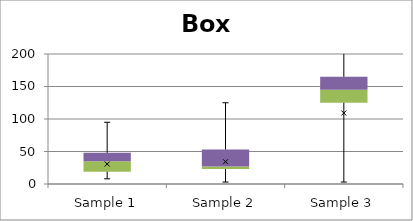
| Category | Min | Q1-Min | Med-Q1 | Q3-Med |
|---|---|---|---|---|
| Sample 1 | 8 | 11 | 16 | 13 |
| Sample 2 | 3 | 20 | 4 | 26 |
| Sample 3 | 3 | 122 | 20 | 20 |